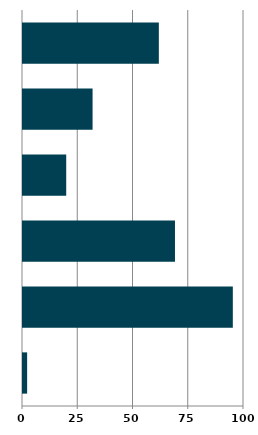
| Category | Series 0 |
|---|---|
| 0 | 1.871 |
| 1 | 94.944 |
| 2 | 68.768 |
| 3 | 19.556 |
| 4 | 31.484 |
| 5 | 61.469 |